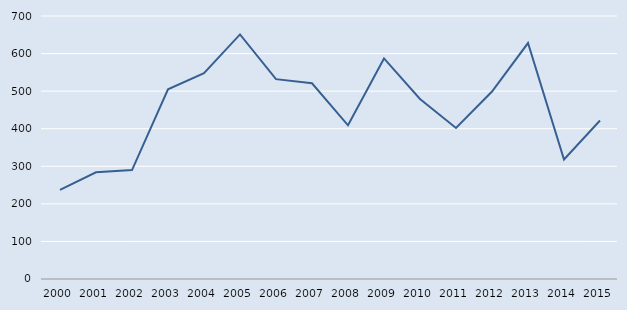
| Category | Series 0 |
|---|---|
| 2000.0 | 237 |
| 2001.0 | 284 |
| 2002.0 | 290 |
| 2003.0 | 505 |
| 2004.0 | 548 |
| 2005.0 | 651 |
| 2006.0 | 532 |
| 2007.0 | 521 |
| 2008.0 | 409 |
| 2009.0 | 587 |
| 2010.0 | 479 |
| 2011.0 | 402 |
| 2012.0 | 499 |
| 2013.0 | 628 |
| 2014.0 | 318 |
| 2015.0 | 422 |